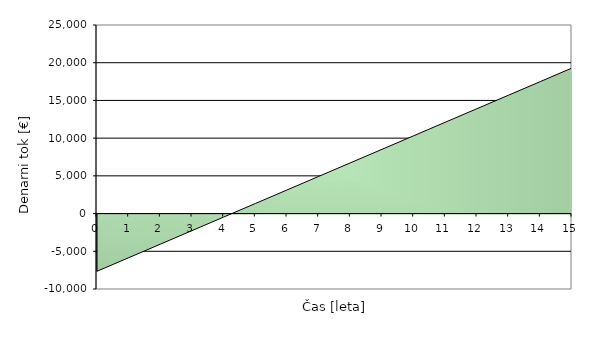
| Category | Series 0 |
|---|---|
| 0.0 | -7650 |
| 1.0 | -5853.487 |
| 2.0 | -4056.974 |
| 3.0 | -2260.461 |
| 4.0 | -463.948 |
| 5.0 | 1332.565 |
| 6.0 | 3129.078 |
| 7.0 | 4925.591 |
| 8.0 | 6722.104 |
| 9.0 | 8518.616 |
| 10.0 | 10315.129 |
| 11.0 | 12111.642 |
| 12.0 | 13908.155 |
| 13.0 | 15704.668 |
| 14.0 | 17501.181 |
| 15.0 | 19297.694 |